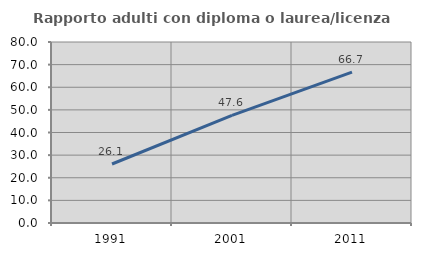
| Category | Rapporto adulti con diploma o laurea/licenza media  |
|---|---|
| 1991.0 | 26.071 |
| 2001.0 | 47.591 |
| 2011.0 | 66.694 |